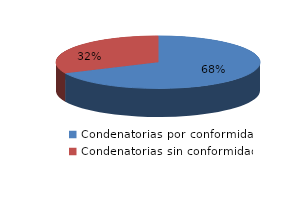
| Category | Series 0 |
|---|---|
| 0 | 64 |
| 1 | 30 |